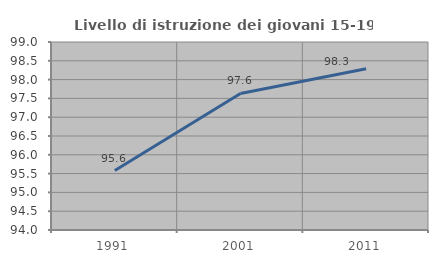
| Category | Livello di istruzione dei giovani 15-19 anni |
|---|---|
| 1991.0 | 95.582 |
| 2001.0 | 97.632 |
| 2011.0 | 98.291 |